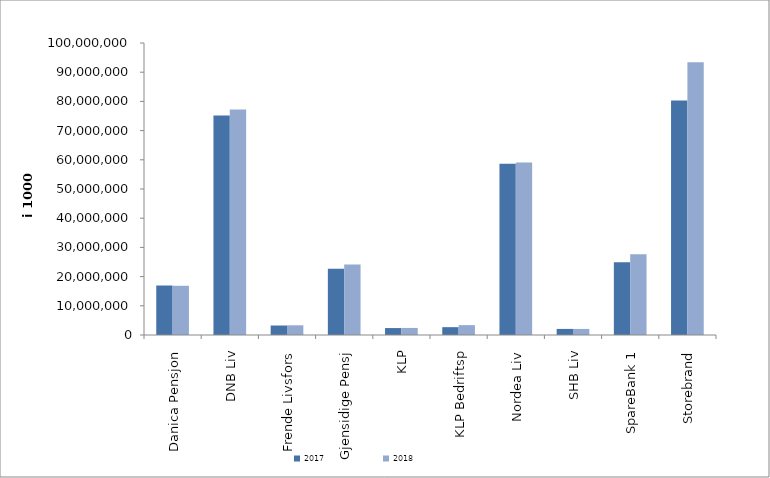
| Category | 2017 | 2018 |
|---|---|---|
| Danica Pensjon | 16948728.281 | 16857045.755 |
| DNB Liv | 75206078.714 | 77241342.397 |
| Frende Livsfors | 3250729.1 | 3320888.775 |
| Gjensidige Pensj | 22680593 | 24101780 |
| KLP | 2373955.596 | 2418695.24 |
| KLP Bedriftsp | 2683785 | 3376787 |
| Nordea Liv | 58646140 | 59037750 |
| SHB Liv | 2082187 | 2076510 |
| SpareBank 1 | 24894504.285 | 27670397.1 |
| Storebrand | 80323761.414 | 93401620.811 |